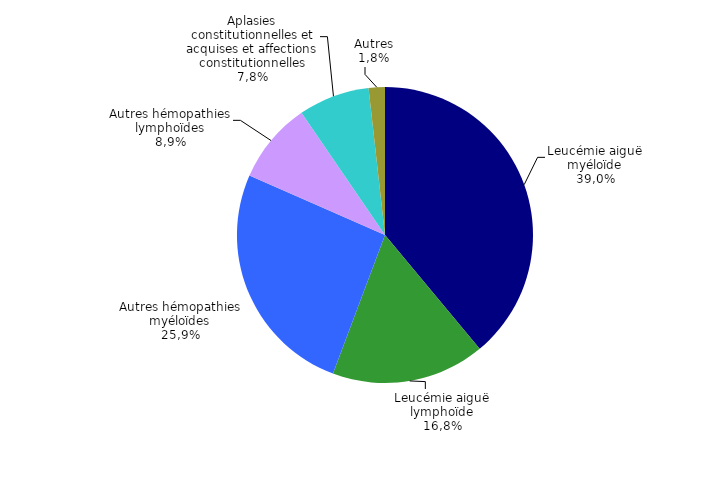
| Category | Nombre |
|---|---|
| Leucémie aiguë myéloïde | 351 |
| Leucémie aiguë lymphoïde | 151 |
| Autres hémopathies myéloïdes | 233 |
| Autres hémopathies lymphoïdes | 80 |
| Aplasies constitutionnelles et acquises et affections constitutionnelles | 70 |
| Autres | 16 |